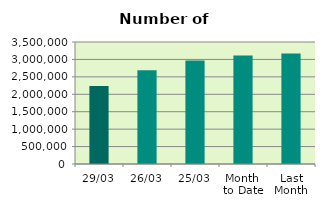
| Category | Series 0 |
|---|---|
| 29/03 | 2236984 |
| 26/03 | 2689892 |
| 25/03 | 2969394 |
| Month 
to Date | 3111656.762 |
| Last
Month | 3172414.4 |